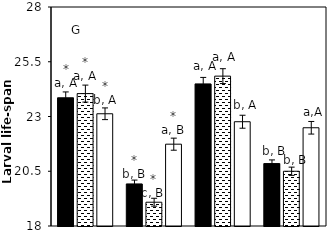
| Category | AB | AC | CK |
|---|---|---|---|
| aCO2-Bt | 23.855 | 24.045 | 23.125 |
| aCO2-Xy | 19.921 | 19.086 | 21.736 |
| eCO2-Bt | 24.489 | 24.843 | 22.761 |
| eCO2-Xy | 20.85 | 20.5 | 22.486 |